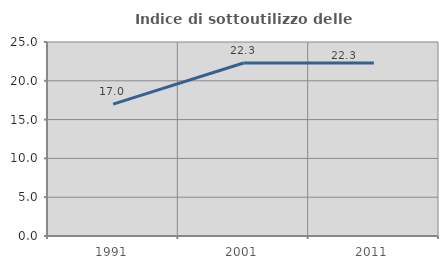
| Category | Indice di sottoutilizzo delle abitazioni  |
|---|---|
| 1991.0 | 17 |
| 2001.0 | 22.294 |
| 2011.0 | 22.296 |